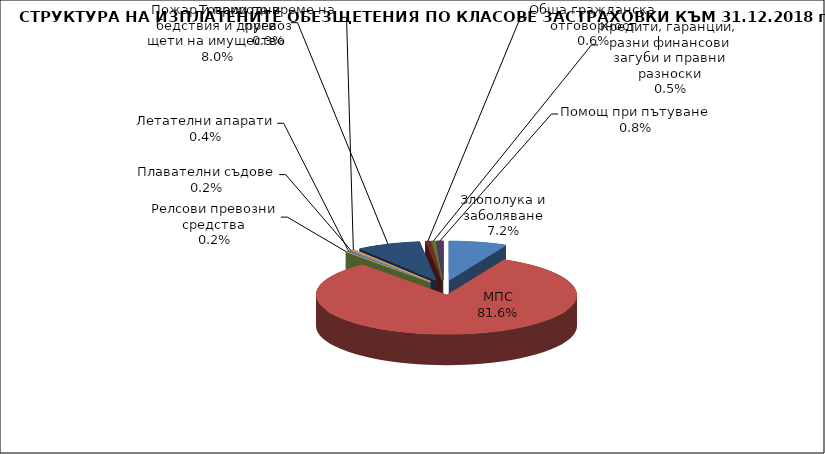
| Category | Злополука и заболяване |
|---|---|
| Злополука и заболяване | 0.072 |
| МПС | 0.816 |
| Релсови превозни средства | 0.002 |
| Летателни апарати | 0.004 |
| Плавателни съдове | 0.002 |
| Товари по време на превоз | 0.003 |
| Пожар и природни бедствия и други щети на имущество | 0.08 |
| Обща гражданска отговорност | 0.006 |
| Кредити, гаранции, разни финансови загуби и правни разноски | 0.005 |
| Помощ при пътуване | 0.008 |